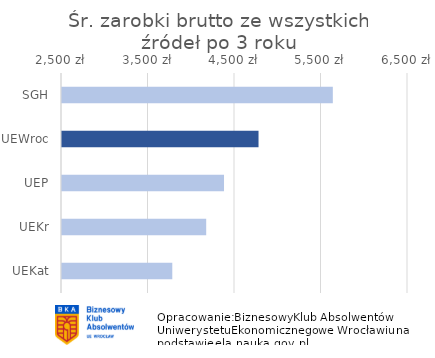
| Category | Śr. zarobki brutto ze wszystkich źródeł po 3 roku |
|---|---|
| SGH | 5631 |
| UEWroc | 4772 |
| UEP | 4373 |
| UEKr | 4167 |
| UEKat | 3775 |